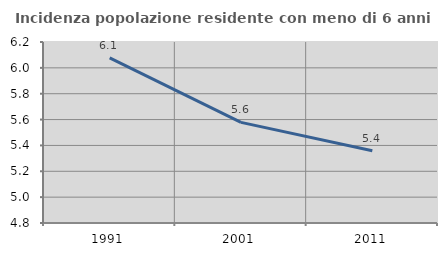
| Category | Incidenza popolazione residente con meno di 6 anni |
|---|---|
| 1991.0 | 6.078 |
| 2001.0 | 5.578 |
| 2011.0 | 5.358 |